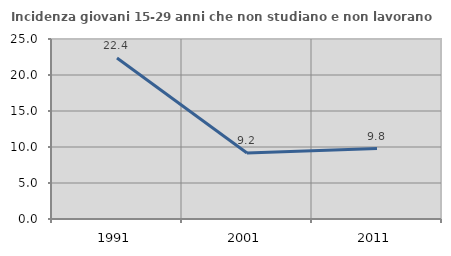
| Category | Incidenza giovani 15-29 anni che non studiano e non lavorano  |
|---|---|
| 1991.0 | 22.362 |
| 2001.0 | 9.164 |
| 2011.0 | 9.777 |